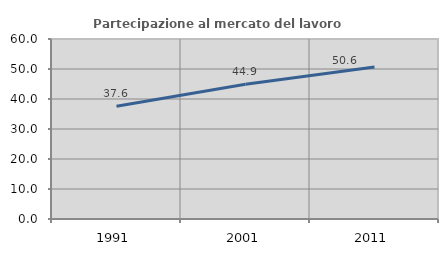
| Category | Partecipazione al mercato del lavoro  femminile |
|---|---|
| 1991.0 | 37.605 |
| 2001.0 | 44.923 |
| 2011.0 | 50.64 |